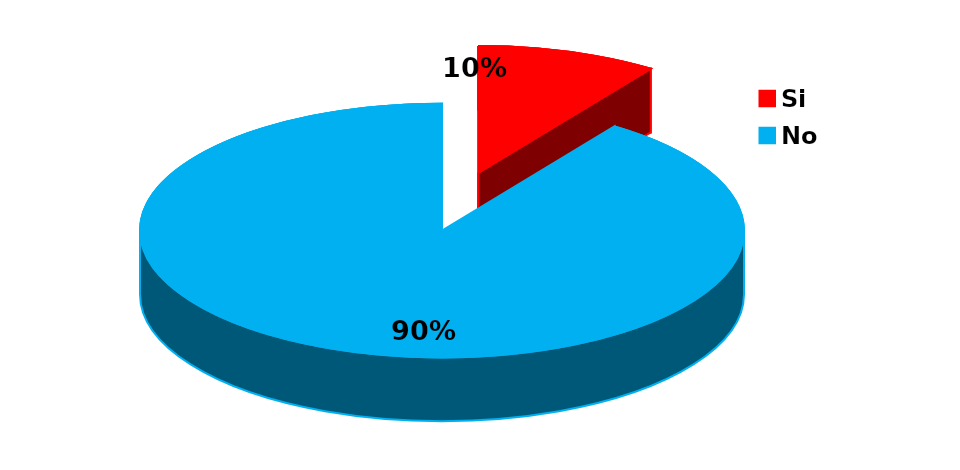
| Category | Series 0 |
|---|---|
| Si | 6 |
| No | 56 |